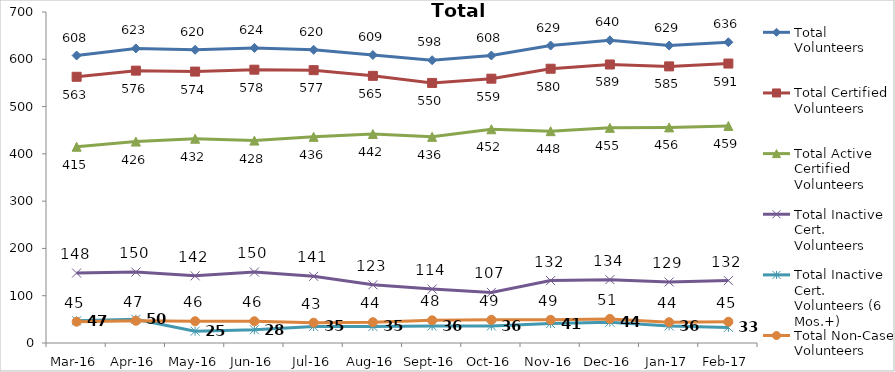
| Category | Total Volunteers | Total Certified Volunteers | Total Active Certified Volunteers | Total Inactive Cert. Volunteers | Total Inactive Cert. Volunteers (6 Mos.+) | Total Non-Case Volunteers |
|---|---|---|---|---|---|---|
| Mar-16 | 608 | 563 | 415 | 148 | 47 | 45 |
| Apr-16 | 623 | 576 | 426 | 150 | 50 | 47 |
| May-16 | 620 | 574 | 432 | 142 | 25 | 46 |
| Jun-16 | 624 | 578 | 428 | 150 | 28 | 46 |
| Jul-16 | 620 | 577 | 436 | 141 | 35 | 43 |
| Aug-16 | 609 | 565 | 442 | 123 | 35 | 44 |
| Sep-16 | 598 | 550 | 436 | 114 | 36 | 48 |
| Oct-16 | 608 | 559 | 452 | 107 | 36 | 49 |
| Nov-16 | 629 | 580 | 448 | 132 | 41 | 49 |
| Dec-16 | 640 | 589 | 455 | 134 | 44 | 51 |
| Jan-17 | 629 | 585 | 456 | 129 | 36 | 44 |
| Feb-17 | 636 | 591 | 459 | 132 | 33 | 45 |